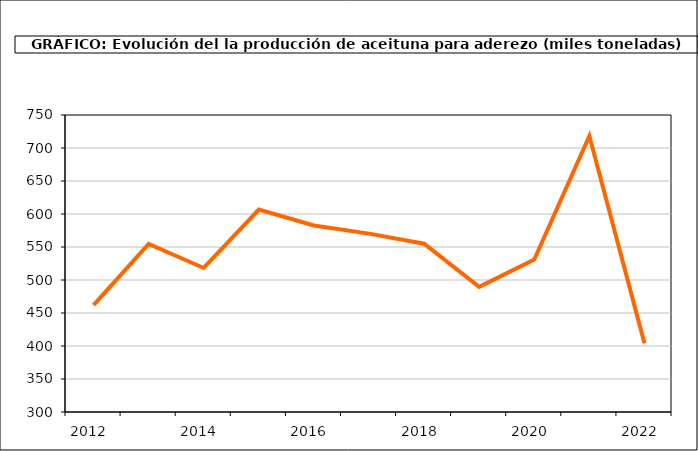
| Category | producción |
|---|---|
| 2012.0 | 461.963 |
| 2013.0 | 554.749 |
| 2014.0 | 518.23 |
| 2015.0 | 606.789 |
| 2016.0 | 582.648 |
| 2017.0 | 570.295 |
| 2018.0 | 555.033 |
| 2019.0 | 489.721 |
| 2020.0 | 531.073 |
| 2021.0 | 718.192 |
| 2022.0 | 404.318 |